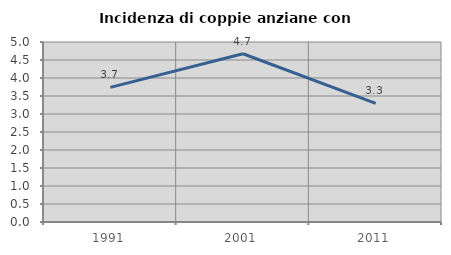
| Category | Incidenza di coppie anziane con figli |
|---|---|
| 1991.0 | 3.738 |
| 2001.0 | 4.673 |
| 2011.0 | 3.297 |